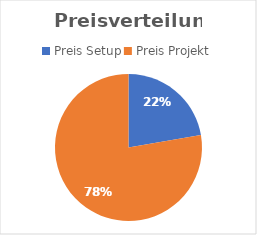
| Category | Series 0 |
|---|---|
| Preis Setup | 56769.231 |
| Preis Projekt | 197916.667 |